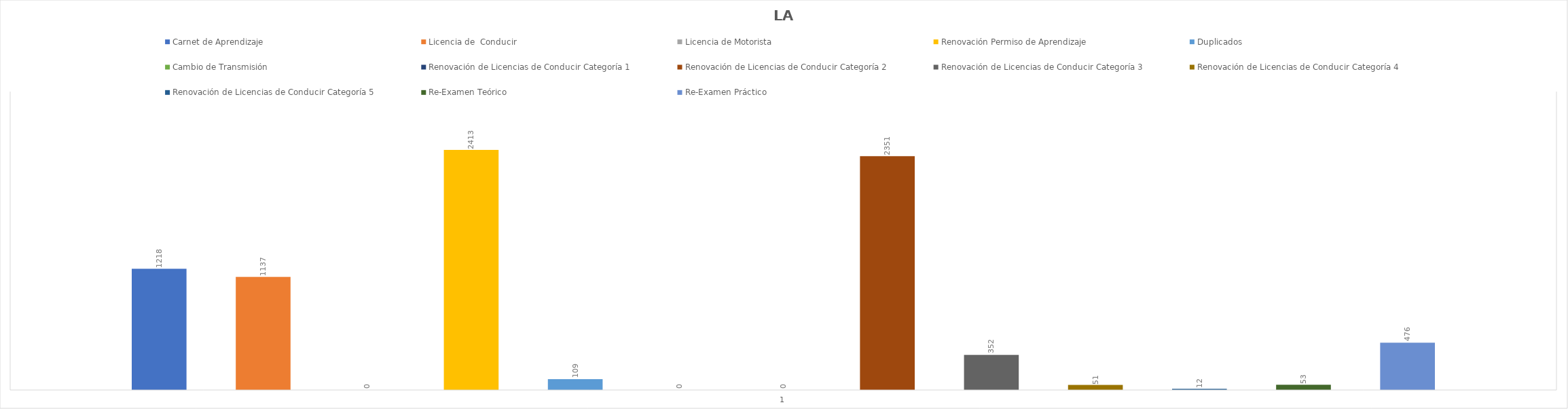
| Category | Carnet de Aprendizaje  | Licencia de  Conducir  | Licencia de Motorista | Renovación Permiso de Aprendizaje | Duplicados  | Cambio de Transmisión  | Renovación de Licencias de Conducir Categoría 1 | Renovación de Licencias de Conducir Categoría 2 | Renovación de Licencias de Conducir Categoría 3 | Renovación de Licencias de Conducir Categoría 4 | Renovación de Licencias de Conducir Categoría 5 | Re-Examen Teórico | Re-Examen Práctico |
|---|---|---|---|---|---|---|---|---|---|---|---|---|---|
| 0 | 1218 | 1137 | 0 | 2413 | 109 | 0 | 0 | 2351 | 352 | 51 | 12 | 53 | 476 |